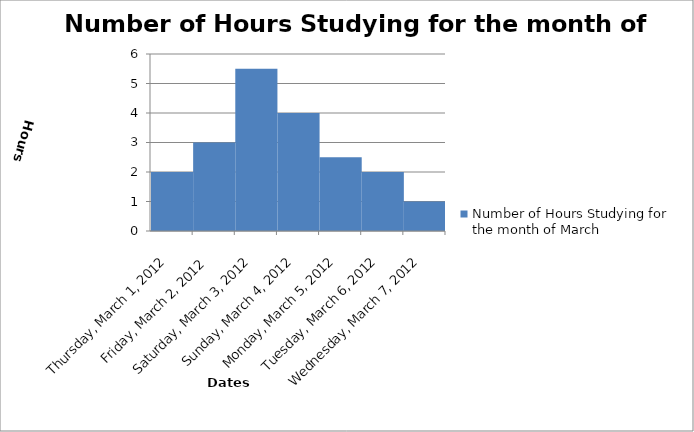
| Category | Number of Hours Studying for the month of March |
|---|---|
| 2012-03-01 | 2 |
| 2012-03-02 | 3 |
| 2012-03-03 | 5.5 |
| 2012-03-04 | 4 |
| 2012-03-05 | 2.5 |
| 2012-03-06 | 2 |
| 2012-03-07 | 1 |